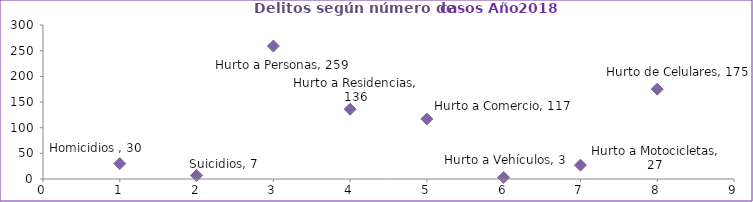
| Category | Series 0 |
|---|---|
| 0 | 30 |
| 1 | 7 |
| 2 | 259 |
| 3 | 136 |
| 4 | 117 |
| 5 | 3 |
| 6 | 27 |
| 7 | 175 |